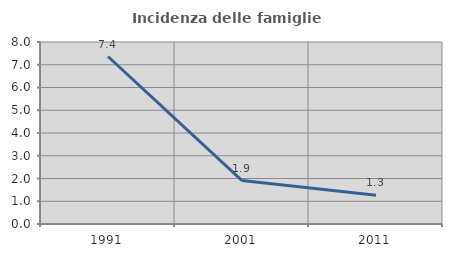
| Category | Incidenza delle famiglie numerose |
|---|---|
| 1991.0 | 7.362 |
| 2001.0 | 1.911 |
| 2011.0 | 1.266 |